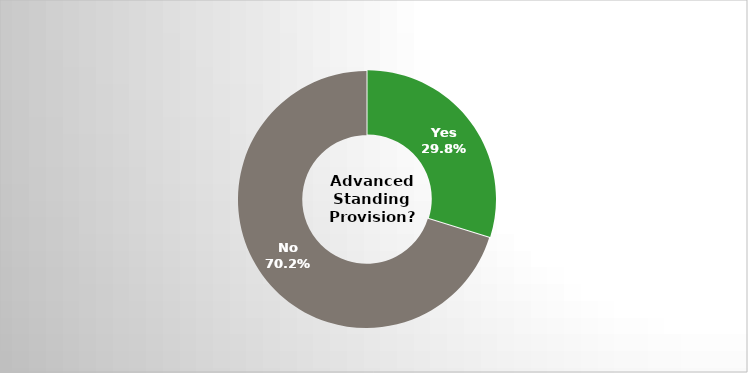
| Category | Series 0 |
|---|---|
| Yes | 0.298 |
| No | 0.702 |